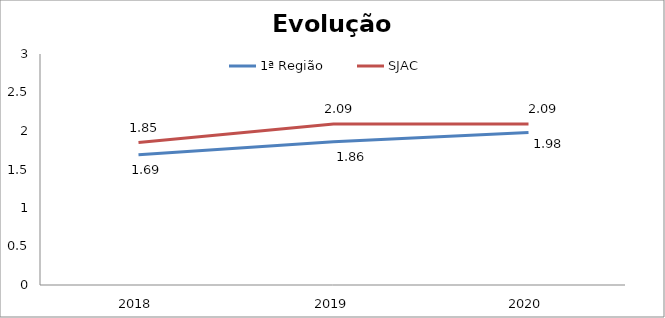
| Category | 1ª Região | SJAC |
|---|---|---|
| 0 | 1.69 | 1.85 |
| 1 | 1.86 | 2.09 |
| 2 | 1.98 | 2.09 |